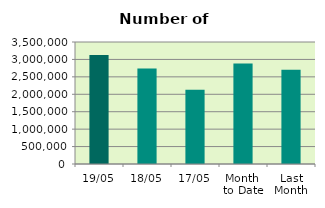
| Category | Series 0 |
|---|---|
| 19/05 | 3125944 |
| 18/05 | 2741858 |
| 17/05 | 2127684 |
| Month 
to Date | 2884298.462 |
| Last
Month | 2707305.9 |